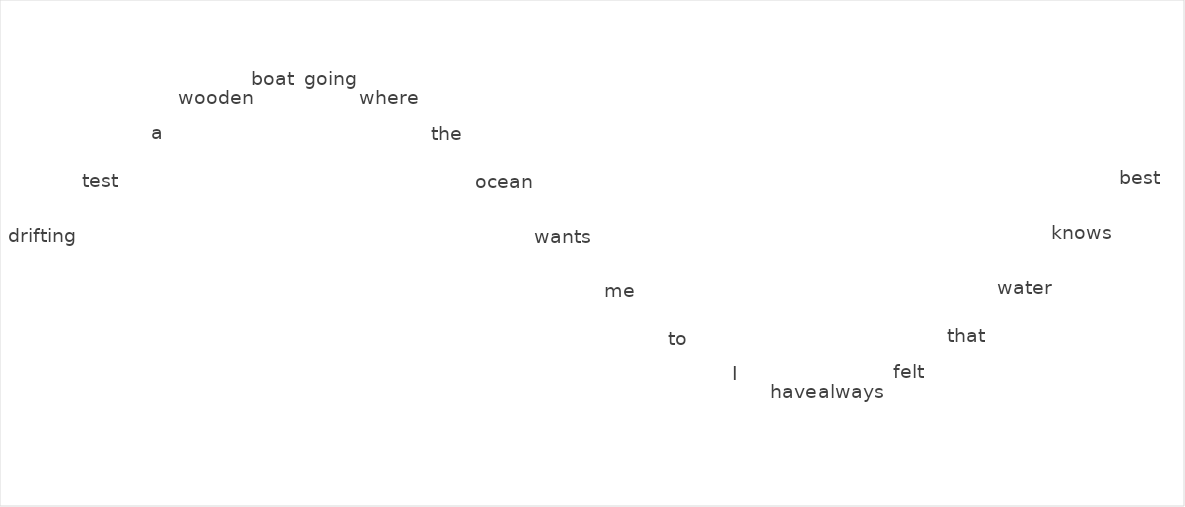
| Category | Series 0 |
|---|---|
| 0 | 0 |
| 1 | 0.343 |
| 2 | 0.644 |
| 3 | 0.867 |
| 4 | 0.985 |
| 5 | 0.984 |
| 6 | 0.863 |
| 7 | 0.638 |
| 8 | 0.335 |
| 9 | -0.008 |
| 10 | -0.351 |
| 11 | -0.651 |
| 12 | -0.872 |
| 13 | -0.987 |
| 14 | -0.982 |
| 15 | -0.859 |
| 16 | -0.631 |
| 17 | -0.327 |
| 18 | 0.017 |
| 19 | 0.359 |